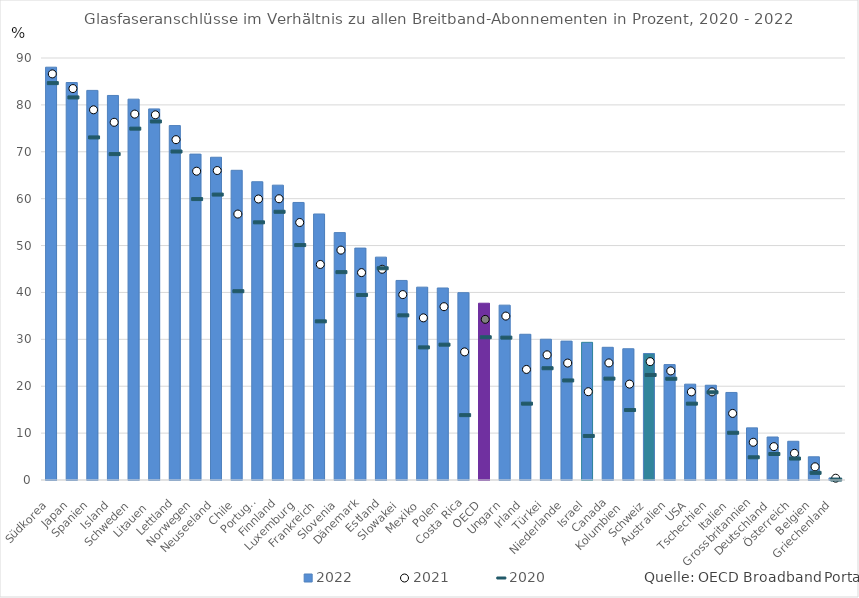
| Category | 2022 |
|---|---|
| Südkorea | 88.04 |
| Japan | 84.77 |
| Spanien | 83.09 |
| Island | 82.01 |
| Schweden | 81.22 |
| Litauen  | 79.14 |
| Lettland | 75.59 |
| Norwegen | 69.5 |
| Neuseeland | 68.83 |
| Chile | 66.05 |
| Portugal | 63.61 |
| Finnland | 62.88 |
| Luxemburg | 59.19 |
| Frankreich | 56.73 |
| Slovenia | 52.76 |
| Dänemark | 49.46 |
| Estland | 47.53 |
| Slowakei | 42.56 |
| Mexiko | 41.13 |
| Polen | 40.95 |
| Costa Rica | 39.95 |
| OECD | 37.7 |
| Ungarn | 37.29 |
| Irland | 31.08 |
| Türkei | 30.02 |
| Niederlande | 29.62 |
| Israel | 29.36 |
| Canada | 28.3 |
| Kolumbien  | 27.99 |
| Schweiz | 26.98 |
| Australien | 24.61 |
| USA | 20.44 |
| Tschechien | 20.21 |
| Italien | 18.67 |
| Grossbritannien | 11.12 |
| Deutschland | 9.17 |
| Österreich | 8.26 |
| Belgien | 4.95 |
| Griechenland | 0.44 |